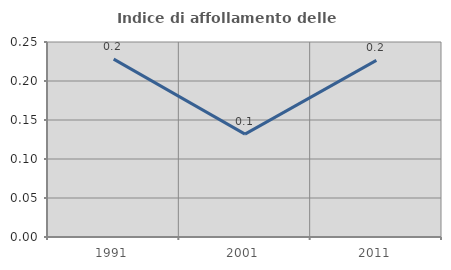
| Category | Indice di affollamento delle abitazioni  |
|---|---|
| 1991.0 | 0.228 |
| 2001.0 | 0.132 |
| 2011.0 | 0.226 |